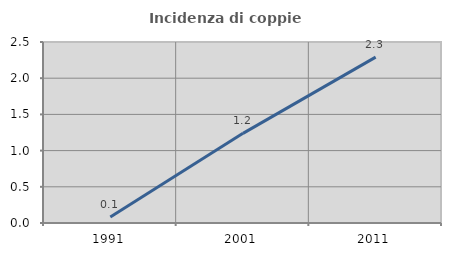
| Category | Incidenza di coppie miste |
|---|---|
| 1991.0 | 0.084 |
| 2001.0 | 1.238 |
| 2011.0 | 2.291 |